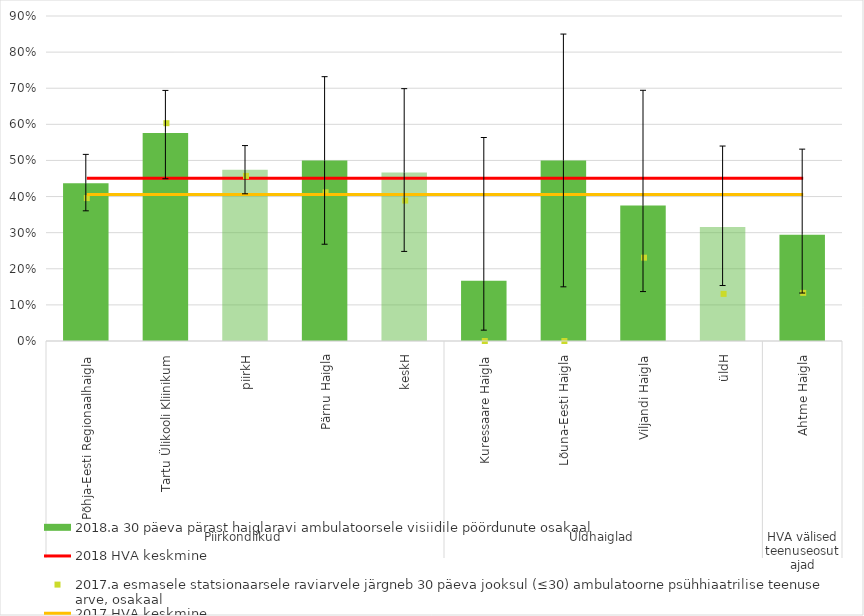
| Category | 2018.a 30 päeva pärast haiglaravi ambulatoorsele visiidile pöördunute osakaal |
|---|---|
| 0 | 0.437 |
| 1 | 0.576 |
| 2 | 0.474 |
| 3 | 0.5 |
| 4 | 0.467 |
| 5 | 0.167 |
| 6 | 0.5 |
| 7 | 0.375 |
| 8 | 0.316 |
| 9 | 0.294 |